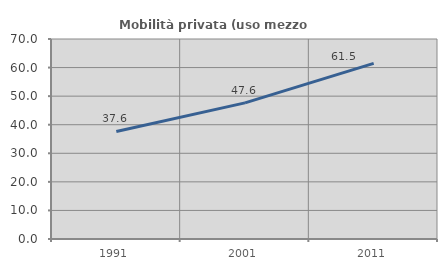
| Category | Mobilità privata (uso mezzo privato) |
|---|---|
| 1991.0 | 37.629 |
| 2001.0 | 47.649 |
| 2011.0 | 61.484 |